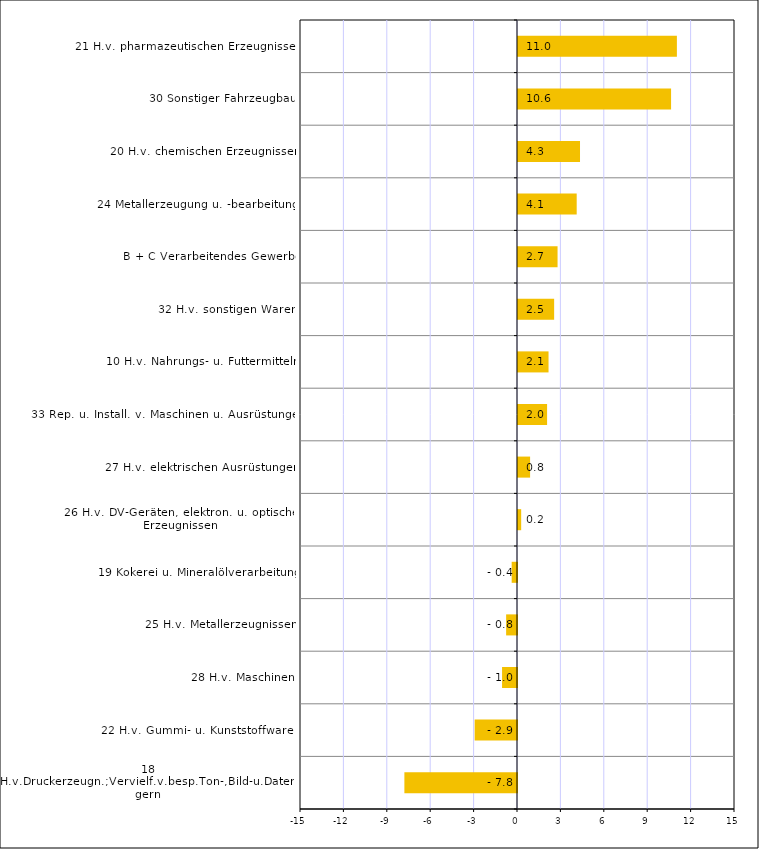
| Category | Series 0 |
|---|---|
| 18 H.v.Druckerzeugn.;Vervielf.v.besp.Ton-,Bild-u.Datenträgern | -7.784 |
| 22 H.v. Gummi- u. Kunststoffwaren | -2.926 |
| 28 H.v. Maschinen | -1.033 |
| 25 H.v. Metallerzeugnissen | -0.751 |
| 19 Kokerei u. Mineralölverarbeitung | -0.368 |
| 26 H.v. DV-Geräten, elektron. u. optischen Erzeugnissen | 0.22 |
| 27 H.v. elektrischen Ausrüstungen | 0.836 |
| 33 Rep. u. Install. v. Maschinen u. Ausrüstungen | 2.01 |
| 10 H.v. Nahrungs- u. Futtermitteln | 2.11 |
| 32 H.v. sonstigen Waren | 2.498 |
| B + C Verarbeitendes Gewerbe | 2.734 |
| 24 Metallerzeugung u. -bearbeitung | 4.057 |
| 20 H.v. chemischen Erzeugnissen | 4.286 |
| 30 Sonstiger Fahrzeugbau | 10.581 |
| 21 H.v. pharmazeutischen Erzeugnissen | 10.983 |